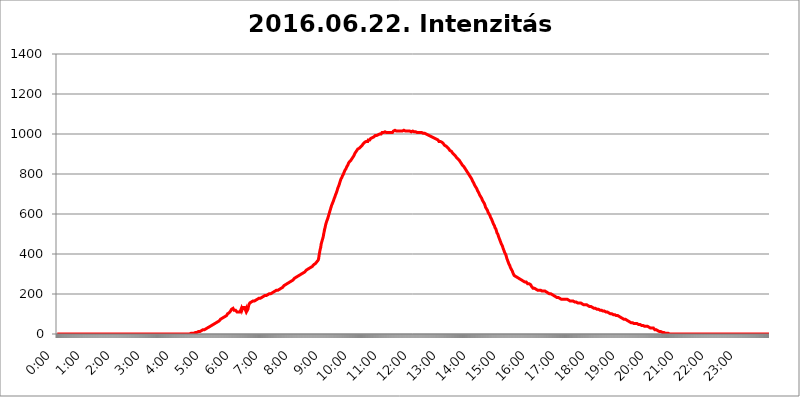
| Category | 2016.06.22. Intenzitás [W/m^2] |
|---|---|
| 0.0 | 0 |
| 0.0006944444444444445 | 0 |
| 0.001388888888888889 | 0 |
| 0.0020833333333333333 | 0 |
| 0.002777777777777778 | 0 |
| 0.003472222222222222 | 0 |
| 0.004166666666666667 | 0 |
| 0.004861111111111111 | 0 |
| 0.005555555555555556 | 0 |
| 0.0062499999999999995 | 0 |
| 0.006944444444444444 | 0 |
| 0.007638888888888889 | 0 |
| 0.008333333333333333 | 0 |
| 0.009027777777777779 | 0 |
| 0.009722222222222222 | 0 |
| 0.010416666666666666 | 0 |
| 0.011111111111111112 | 0 |
| 0.011805555555555555 | 0 |
| 0.012499999999999999 | 0 |
| 0.013194444444444444 | 0 |
| 0.013888888888888888 | 0 |
| 0.014583333333333332 | 0 |
| 0.015277777777777777 | 0 |
| 0.015972222222222224 | 0 |
| 0.016666666666666666 | 0 |
| 0.017361111111111112 | 0 |
| 0.018055555555555557 | 0 |
| 0.01875 | 0 |
| 0.019444444444444445 | 0 |
| 0.02013888888888889 | 0 |
| 0.020833333333333332 | 0 |
| 0.02152777777777778 | 0 |
| 0.022222222222222223 | 0 |
| 0.02291666666666667 | 0 |
| 0.02361111111111111 | 0 |
| 0.024305555555555556 | 0 |
| 0.024999999999999998 | 0 |
| 0.025694444444444447 | 0 |
| 0.02638888888888889 | 0 |
| 0.027083333333333334 | 0 |
| 0.027777777777777776 | 0 |
| 0.02847222222222222 | 0 |
| 0.029166666666666664 | 0 |
| 0.029861111111111113 | 0 |
| 0.030555555555555555 | 0 |
| 0.03125 | 0 |
| 0.03194444444444445 | 0 |
| 0.03263888888888889 | 0 |
| 0.03333333333333333 | 0 |
| 0.034027777777777775 | 0 |
| 0.034722222222222224 | 0 |
| 0.035416666666666666 | 0 |
| 0.036111111111111115 | 0 |
| 0.03680555555555556 | 0 |
| 0.0375 | 0 |
| 0.03819444444444444 | 0 |
| 0.03888888888888889 | 0 |
| 0.03958333333333333 | 0 |
| 0.04027777777777778 | 0 |
| 0.04097222222222222 | 0 |
| 0.041666666666666664 | 0 |
| 0.042361111111111106 | 0 |
| 0.04305555555555556 | 0 |
| 0.043750000000000004 | 0 |
| 0.044444444444444446 | 0 |
| 0.04513888888888889 | 0 |
| 0.04583333333333334 | 0 |
| 0.04652777777777778 | 0 |
| 0.04722222222222222 | 0 |
| 0.04791666666666666 | 0 |
| 0.04861111111111111 | 0 |
| 0.049305555555555554 | 0 |
| 0.049999999999999996 | 0 |
| 0.05069444444444445 | 0 |
| 0.051388888888888894 | 0 |
| 0.052083333333333336 | 0 |
| 0.05277777777777778 | 0 |
| 0.05347222222222222 | 0 |
| 0.05416666666666667 | 0 |
| 0.05486111111111111 | 0 |
| 0.05555555555555555 | 0 |
| 0.05625 | 0 |
| 0.05694444444444444 | 0 |
| 0.057638888888888885 | 0 |
| 0.05833333333333333 | 0 |
| 0.05902777777777778 | 0 |
| 0.059722222222222225 | 0 |
| 0.06041666666666667 | 0 |
| 0.061111111111111116 | 0 |
| 0.06180555555555556 | 0 |
| 0.0625 | 0 |
| 0.06319444444444444 | 0 |
| 0.06388888888888888 | 0 |
| 0.06458333333333334 | 0 |
| 0.06527777777777778 | 0 |
| 0.06597222222222222 | 0 |
| 0.06666666666666667 | 0 |
| 0.06736111111111111 | 0 |
| 0.06805555555555555 | 0 |
| 0.06874999999999999 | 0 |
| 0.06944444444444443 | 0 |
| 0.07013888888888889 | 0 |
| 0.07083333333333333 | 0 |
| 0.07152777777777779 | 0 |
| 0.07222222222222223 | 0 |
| 0.07291666666666667 | 0 |
| 0.07361111111111111 | 0 |
| 0.07430555555555556 | 0 |
| 0.075 | 0 |
| 0.07569444444444444 | 0 |
| 0.0763888888888889 | 0 |
| 0.07708333333333334 | 0 |
| 0.07777777777777778 | 0 |
| 0.07847222222222222 | 0 |
| 0.07916666666666666 | 0 |
| 0.0798611111111111 | 0 |
| 0.08055555555555556 | 0 |
| 0.08125 | 0 |
| 0.08194444444444444 | 0 |
| 0.08263888888888889 | 0 |
| 0.08333333333333333 | 0 |
| 0.08402777777777777 | 0 |
| 0.08472222222222221 | 0 |
| 0.08541666666666665 | 0 |
| 0.08611111111111112 | 0 |
| 0.08680555555555557 | 0 |
| 0.08750000000000001 | 0 |
| 0.08819444444444445 | 0 |
| 0.08888888888888889 | 0 |
| 0.08958333333333333 | 0 |
| 0.09027777777777778 | 0 |
| 0.09097222222222222 | 0 |
| 0.09166666666666667 | 0 |
| 0.09236111111111112 | 0 |
| 0.09305555555555556 | 0 |
| 0.09375 | 0 |
| 0.09444444444444444 | 0 |
| 0.09513888888888888 | 0 |
| 0.09583333333333333 | 0 |
| 0.09652777777777777 | 0 |
| 0.09722222222222222 | 0 |
| 0.09791666666666667 | 0 |
| 0.09861111111111111 | 0 |
| 0.09930555555555555 | 0 |
| 0.09999999999999999 | 0 |
| 0.10069444444444443 | 0 |
| 0.1013888888888889 | 0 |
| 0.10208333333333335 | 0 |
| 0.10277777777777779 | 0 |
| 0.10347222222222223 | 0 |
| 0.10416666666666667 | 0 |
| 0.10486111111111111 | 0 |
| 0.10555555555555556 | 0 |
| 0.10625 | 0 |
| 0.10694444444444444 | 0 |
| 0.1076388888888889 | 0 |
| 0.10833333333333334 | 0 |
| 0.10902777777777778 | 0 |
| 0.10972222222222222 | 0 |
| 0.1111111111111111 | 0 |
| 0.11180555555555556 | 0 |
| 0.11180555555555556 | 0 |
| 0.1125 | 0 |
| 0.11319444444444444 | 0 |
| 0.11388888888888889 | 0 |
| 0.11458333333333333 | 0 |
| 0.11527777777777777 | 0 |
| 0.11597222222222221 | 0 |
| 0.11666666666666665 | 0 |
| 0.1173611111111111 | 0 |
| 0.11805555555555557 | 0 |
| 0.11944444444444445 | 0 |
| 0.12013888888888889 | 0 |
| 0.12083333333333333 | 0 |
| 0.12152777777777778 | 0 |
| 0.12222222222222223 | 0 |
| 0.12291666666666667 | 0 |
| 0.12291666666666667 | 0 |
| 0.12361111111111112 | 0 |
| 0.12430555555555556 | 0 |
| 0.125 | 0 |
| 0.12569444444444444 | 0 |
| 0.12638888888888888 | 0 |
| 0.12708333333333333 | 0 |
| 0.16875 | 0 |
| 0.12847222222222224 | 0 |
| 0.12916666666666668 | 0 |
| 0.12986111111111112 | 0 |
| 0.13055555555555556 | 0 |
| 0.13125 | 0 |
| 0.13194444444444445 | 0 |
| 0.1326388888888889 | 0 |
| 0.13333333333333333 | 0 |
| 0.13402777777777777 | 0 |
| 0.13402777777777777 | 0 |
| 0.13472222222222222 | 0 |
| 0.13541666666666666 | 0 |
| 0.1361111111111111 | 0 |
| 0.13749999999999998 | 0 |
| 0.13819444444444443 | 0 |
| 0.1388888888888889 | 0 |
| 0.13958333333333334 | 0 |
| 0.14027777777777778 | 0 |
| 0.14097222222222222 | 0 |
| 0.14166666666666666 | 0 |
| 0.1423611111111111 | 0 |
| 0.14305555555555557 | 0 |
| 0.14375000000000002 | 0 |
| 0.14444444444444446 | 0 |
| 0.1451388888888889 | 0 |
| 0.1451388888888889 | 0 |
| 0.14652777777777778 | 0 |
| 0.14722222222222223 | 0 |
| 0.14791666666666667 | 0 |
| 0.1486111111111111 | 0 |
| 0.14930555555555555 | 0 |
| 0.15 | 0 |
| 0.15069444444444444 | 0 |
| 0.15138888888888888 | 0 |
| 0.15208333333333332 | 0 |
| 0.15277777777777776 | 0 |
| 0.15347222222222223 | 0 |
| 0.15416666666666667 | 0 |
| 0.15486111111111112 | 0 |
| 0.15555555555555556 | 0 |
| 0.15625 | 0 |
| 0.15694444444444444 | 0 |
| 0.15763888888888888 | 0 |
| 0.15833333333333333 | 0 |
| 0.15902777777777777 | 0 |
| 0.15972222222222224 | 0 |
| 0.16041666666666668 | 0 |
| 0.16111111111111112 | 0 |
| 0.16180555555555556 | 0 |
| 0.1625 | 0 |
| 0.16319444444444445 | 0 |
| 0.1638888888888889 | 0 |
| 0.16458333333333333 | 0 |
| 0.16527777777777777 | 0 |
| 0.16597222222222222 | 0 |
| 0.16666666666666666 | 0 |
| 0.1673611111111111 | 0 |
| 0.16805555555555554 | 0 |
| 0.16874999999999998 | 0 |
| 0.16944444444444443 | 0 |
| 0.17013888888888887 | 0 |
| 0.1708333333333333 | 0 |
| 0.17152777777777775 | 0 |
| 0.17222222222222225 | 0 |
| 0.1729166666666667 | 0 |
| 0.17361111111111113 | 0 |
| 0.17430555555555557 | 0 |
| 0.17500000000000002 | 0 |
| 0.17569444444444446 | 0 |
| 0.1763888888888889 | 0 |
| 0.17708333333333334 | 0 |
| 0.17777777777777778 | 0 |
| 0.17847222222222223 | 0 |
| 0.17916666666666667 | 0 |
| 0.1798611111111111 | 0 |
| 0.18055555555555555 | 0 |
| 0.18125 | 0 |
| 0.18194444444444444 | 0 |
| 0.1826388888888889 | 0 |
| 0.18333333333333335 | 0 |
| 0.1840277777777778 | 0 |
| 0.18472222222222223 | 0 |
| 0.18541666666666667 | 0 |
| 0.18611111111111112 | 0 |
| 0.18680555555555556 | 3.525 |
| 0.1875 | 3.525 |
| 0.18819444444444444 | 3.525 |
| 0.18888888888888888 | 3.525 |
| 0.18958333333333333 | 3.525 |
| 0.19027777777777777 | 3.525 |
| 0.1909722222222222 | 3.525 |
| 0.19166666666666665 | 3.525 |
| 0.19236111111111112 | 3.525 |
| 0.19305555555555554 | 7.887 |
| 0.19375 | 7.887 |
| 0.19444444444444445 | 7.887 |
| 0.1951388888888889 | 7.887 |
| 0.19583333333333333 | 7.887 |
| 0.19652777777777777 | 7.887 |
| 0.19722222222222222 | 12.257 |
| 0.19791666666666666 | 12.257 |
| 0.1986111111111111 | 12.257 |
| 0.19930555555555554 | 12.257 |
| 0.19999999999999998 | 12.257 |
| 0.20069444444444443 | 16.636 |
| 0.20138888888888887 | 16.636 |
| 0.2020833333333333 | 16.636 |
| 0.2027777777777778 | 16.636 |
| 0.2034722222222222 | 21.024 |
| 0.2041666666666667 | 21.024 |
| 0.20486111111111113 | 21.024 |
| 0.20555555555555557 | 21.024 |
| 0.20625000000000002 | 21.024 |
| 0.20694444444444446 | 25.419 |
| 0.2076388888888889 | 25.419 |
| 0.20833333333333334 | 25.419 |
| 0.20902777777777778 | 29.823 |
| 0.20972222222222223 | 29.823 |
| 0.21041666666666667 | 29.823 |
| 0.2111111111111111 | 34.234 |
| 0.21180555555555555 | 34.234 |
| 0.2125 | 34.234 |
| 0.21319444444444444 | 34.234 |
| 0.2138888888888889 | 38.653 |
| 0.21458333333333335 | 38.653 |
| 0.2152777777777778 | 38.653 |
| 0.21597222222222223 | 43.079 |
| 0.21666666666666667 | 43.079 |
| 0.21736111111111112 | 43.079 |
| 0.21805555555555556 | 47.511 |
| 0.21875 | 47.511 |
| 0.21944444444444444 | 47.511 |
| 0.22013888888888888 | 47.511 |
| 0.22083333333333333 | 51.951 |
| 0.22152777777777777 | 51.951 |
| 0.2222222222222222 | 56.398 |
| 0.22291666666666665 | 56.398 |
| 0.2236111111111111 | 60.85 |
| 0.22430555555555556 | 60.85 |
| 0.225 | 60.85 |
| 0.22569444444444445 | 65.31 |
| 0.2263888888888889 | 65.31 |
| 0.22708333333333333 | 65.31 |
| 0.22777777777777777 | 69.775 |
| 0.22847222222222222 | 69.775 |
| 0.22916666666666666 | 74.246 |
| 0.2298611111111111 | 74.246 |
| 0.23055555555555554 | 74.246 |
| 0.23124999999999998 | 78.722 |
| 0.23194444444444443 | 78.722 |
| 0.23263888888888887 | 78.722 |
| 0.2333333333333333 | 83.205 |
| 0.2340277777777778 | 83.205 |
| 0.2347222222222222 | 87.692 |
| 0.2354166666666667 | 87.692 |
| 0.23611111111111113 | 92.184 |
| 0.23680555555555557 | 92.184 |
| 0.23750000000000002 | 92.184 |
| 0.23819444444444446 | 96.682 |
| 0.2388888888888889 | 101.184 |
| 0.23958333333333334 | 101.184 |
| 0.24027777777777778 | 105.69 |
| 0.24097222222222223 | 105.69 |
| 0.24166666666666667 | 110.201 |
| 0.2423611111111111 | 110.201 |
| 0.24305555555555555 | 114.716 |
| 0.24375 | 119.235 |
| 0.24444444444444446 | 123.758 |
| 0.24513888888888888 | 123.758 |
| 0.24583333333333335 | 128.284 |
| 0.2465277777777778 | 128.284 |
| 0.24722222222222223 | 128.284 |
| 0.24791666666666667 | 119.235 |
| 0.24861111111111112 | 119.235 |
| 0.24930555555555556 | 123.758 |
| 0.25 | 119.235 |
| 0.25069444444444444 | 119.235 |
| 0.2513888888888889 | 114.716 |
| 0.2520833333333333 | 110.201 |
| 0.25277777777777777 | 110.201 |
| 0.2534722222222222 | 110.201 |
| 0.25416666666666665 | 110.201 |
| 0.2548611111111111 | 110.201 |
| 0.2555555555555556 | 110.201 |
| 0.25625000000000003 | 110.201 |
| 0.2569444444444445 | 110.201 |
| 0.2576388888888889 | 114.716 |
| 0.25833333333333336 | 128.284 |
| 0.2590277777777778 | 119.235 |
| 0.25972222222222224 | 119.235 |
| 0.2604166666666667 | 132.814 |
| 0.2611111111111111 | 132.814 |
| 0.26180555555555557 | 137.347 |
| 0.2625 | 132.814 |
| 0.26319444444444445 | 132.814 |
| 0.2638888888888889 | 137.347 |
| 0.26458333333333334 | 114.716 |
| 0.2652777777777778 | 123.758 |
| 0.2659722222222222 | 114.716 |
| 0.26666666666666666 | 119.235 |
| 0.2673611111111111 | 123.758 |
| 0.26805555555555555 | 123.758 |
| 0.26875 | 146.423 |
| 0.26944444444444443 | 150.964 |
| 0.2701388888888889 | 155.509 |
| 0.2708333333333333 | 155.509 |
| 0.27152777777777776 | 160.056 |
| 0.2722222222222222 | 160.056 |
| 0.27291666666666664 | 160.056 |
| 0.2736111111111111 | 164.605 |
| 0.2743055555555555 | 164.605 |
| 0.27499999999999997 | 164.605 |
| 0.27569444444444446 | 164.605 |
| 0.27638888888888885 | 164.605 |
| 0.27708333333333335 | 169.156 |
| 0.2777777777777778 | 169.156 |
| 0.27847222222222223 | 169.156 |
| 0.2791666666666667 | 169.156 |
| 0.2798611111111111 | 173.709 |
| 0.28055555555555556 | 173.709 |
| 0.28125 | 173.709 |
| 0.28194444444444444 | 173.709 |
| 0.2826388888888889 | 178.264 |
| 0.2833333333333333 | 178.264 |
| 0.28402777777777777 | 178.264 |
| 0.2847222222222222 | 178.264 |
| 0.28541666666666665 | 182.82 |
| 0.28611111111111115 | 182.82 |
| 0.28680555555555554 | 182.82 |
| 0.28750000000000003 | 182.82 |
| 0.2881944444444445 | 187.378 |
| 0.2888888888888889 | 187.378 |
| 0.28958333333333336 | 187.378 |
| 0.2902777777777778 | 187.378 |
| 0.29097222222222224 | 191.937 |
| 0.2916666666666667 | 191.937 |
| 0.2923611111111111 | 191.937 |
| 0.29305555555555557 | 191.937 |
| 0.29375 | 196.497 |
| 0.29444444444444445 | 196.497 |
| 0.2951388888888889 | 196.497 |
| 0.29583333333333334 | 201.058 |
| 0.2965277777777778 | 201.058 |
| 0.2972222222222222 | 201.058 |
| 0.29791666666666666 | 201.058 |
| 0.2986111111111111 | 201.058 |
| 0.29930555555555555 | 201.058 |
| 0.3 | 205.62 |
| 0.30069444444444443 | 205.62 |
| 0.3013888888888889 | 205.62 |
| 0.3020833333333333 | 210.182 |
| 0.30277777777777776 | 210.182 |
| 0.3034722222222222 | 210.182 |
| 0.30416666666666664 | 210.182 |
| 0.3048611111111111 | 214.746 |
| 0.3055555555555555 | 214.746 |
| 0.30624999999999997 | 214.746 |
| 0.3069444444444444 | 214.746 |
| 0.3076388888888889 | 219.309 |
| 0.30833333333333335 | 219.309 |
| 0.3090277777777778 | 219.309 |
| 0.30972222222222223 | 219.309 |
| 0.3104166666666667 | 223.873 |
| 0.3111111111111111 | 223.873 |
| 0.31180555555555556 | 223.873 |
| 0.3125 | 228.436 |
| 0.31319444444444444 | 228.436 |
| 0.3138888888888889 | 228.436 |
| 0.3145833333333333 | 233 |
| 0.31527777777777777 | 233 |
| 0.3159722222222222 | 233 |
| 0.31666666666666665 | 237.564 |
| 0.31736111111111115 | 237.564 |
| 0.31805555555555554 | 242.127 |
| 0.31875000000000003 | 242.127 |
| 0.3194444444444445 | 242.127 |
| 0.3201388888888889 | 246.689 |
| 0.32083333333333336 | 246.689 |
| 0.3215277777777778 | 251.251 |
| 0.32222222222222224 | 251.251 |
| 0.3229166666666667 | 251.251 |
| 0.3236111111111111 | 255.813 |
| 0.32430555555555557 | 255.813 |
| 0.325 | 255.813 |
| 0.32569444444444445 | 260.373 |
| 0.3263888888888889 | 260.373 |
| 0.32708333333333334 | 260.373 |
| 0.3277777777777778 | 264.932 |
| 0.3284722222222222 | 264.932 |
| 0.32916666666666666 | 269.49 |
| 0.3298611111111111 | 269.49 |
| 0.33055555555555555 | 269.49 |
| 0.33125 | 274.047 |
| 0.33194444444444443 | 274.047 |
| 0.3326388888888889 | 278.603 |
| 0.3333333333333333 | 278.603 |
| 0.3340277777777778 | 278.603 |
| 0.3347222222222222 | 283.156 |
| 0.3354166666666667 | 283.156 |
| 0.3361111111111111 | 283.156 |
| 0.3368055555555556 | 287.709 |
| 0.33749999999999997 | 287.709 |
| 0.33819444444444446 | 287.709 |
| 0.33888888888888885 | 292.259 |
| 0.33958333333333335 | 292.259 |
| 0.34027777777777773 | 296.808 |
| 0.34097222222222223 | 296.808 |
| 0.3416666666666666 | 296.808 |
| 0.3423611111111111 | 301.354 |
| 0.3430555555555555 | 301.354 |
| 0.34375 | 305.898 |
| 0.3444444444444445 | 305.898 |
| 0.3451388888888889 | 305.898 |
| 0.3458333333333334 | 310.44 |
| 0.34652777777777777 | 310.44 |
| 0.34722222222222227 | 310.44 |
| 0.34791666666666665 | 314.98 |
| 0.34861111111111115 | 314.98 |
| 0.34930555555555554 | 319.517 |
| 0.35000000000000003 | 319.517 |
| 0.3506944444444444 | 324.052 |
| 0.3513888888888889 | 324.052 |
| 0.3520833333333333 | 324.052 |
| 0.3527777777777778 | 328.584 |
| 0.3534722222222222 | 328.584 |
| 0.3541666666666667 | 328.584 |
| 0.3548611111111111 | 333.113 |
| 0.35555555555555557 | 333.113 |
| 0.35625 | 337.639 |
| 0.35694444444444445 | 337.639 |
| 0.3576388888888889 | 337.639 |
| 0.35833333333333334 | 342.162 |
| 0.3590277777777778 | 342.162 |
| 0.3597222222222222 | 346.682 |
| 0.36041666666666666 | 351.198 |
| 0.3611111111111111 | 351.198 |
| 0.36180555555555555 | 351.198 |
| 0.3625 | 355.712 |
| 0.36319444444444443 | 355.712 |
| 0.3638888888888889 | 360.221 |
| 0.3645833333333333 | 360.221 |
| 0.3652777777777778 | 364.728 |
| 0.3659722222222222 | 369.23 |
| 0.3666666666666667 | 378.224 |
| 0.3673611111111111 | 396.164 |
| 0.3680555555555556 | 409.574 |
| 0.36874999999999997 | 422.943 |
| 0.36944444444444446 | 431.833 |
| 0.37013888888888885 | 449.551 |
| 0.37083333333333335 | 458.38 |
| 0.37152777777777773 | 467.187 |
| 0.37222222222222223 | 475.972 |
| 0.3729166666666666 | 484.735 |
| 0.3736111111111111 | 497.836 |
| 0.3743055555555555 | 510.885 |
| 0.375 | 523.88 |
| 0.3756944444444445 | 532.513 |
| 0.3763888888888889 | 545.416 |
| 0.3770833333333334 | 553.986 |
| 0.37777777777777777 | 562.53 |
| 0.37847222222222227 | 566.793 |
| 0.37916666666666665 | 575.299 |
| 0.37986111111111115 | 583.779 |
| 0.38055555555555554 | 592.233 |
| 0.38125000000000003 | 600.661 |
| 0.3819444444444444 | 609.062 |
| 0.3826388888888889 | 617.436 |
| 0.3833333333333333 | 625.784 |
| 0.3840277777777778 | 634.105 |
| 0.3847222222222222 | 642.4 |
| 0.3854166666666667 | 646.537 |
| 0.3861111111111111 | 654.791 |
| 0.38680555555555557 | 658.909 |
| 0.3875 | 667.123 |
| 0.38819444444444445 | 675.311 |
| 0.3888888888888889 | 679.395 |
| 0.38958333333333334 | 687.544 |
| 0.3902777777777778 | 695.666 |
| 0.3909722222222222 | 699.717 |
| 0.39166666666666666 | 707.8 |
| 0.3923611111111111 | 715.858 |
| 0.39305555555555555 | 723.889 |
| 0.39375 | 731.896 |
| 0.39444444444444443 | 735.89 |
| 0.3951388888888889 | 743.859 |
| 0.3958333333333333 | 751.803 |
| 0.3965277777777778 | 759.723 |
| 0.3972222222222222 | 767.62 |
| 0.3979166666666667 | 775.492 |
| 0.3986111111111111 | 779.42 |
| 0.3993055555555556 | 783.342 |
| 0.39999999999999997 | 791.169 |
| 0.40069444444444446 | 795.074 |
| 0.40138888888888885 | 798.974 |
| 0.40208333333333335 | 806.757 |
| 0.40277777777777773 | 810.641 |
| 0.40347222222222223 | 818.392 |
| 0.4041666666666666 | 822.26 |
| 0.4048611111111111 | 826.123 |
| 0.4055555555555555 | 829.981 |
| 0.40625 | 837.682 |
| 0.4069444444444445 | 841.526 |
| 0.4076388888888889 | 845.365 |
| 0.4083333333333334 | 853.029 |
| 0.40902777777777777 | 856.855 |
| 0.40972222222222227 | 860.676 |
| 0.41041666666666665 | 860.676 |
| 0.41111111111111115 | 864.493 |
| 0.41180555555555554 | 868.305 |
| 0.41250000000000003 | 872.114 |
| 0.4131944444444444 | 875.918 |
| 0.4138888888888889 | 879.719 |
| 0.4145833333333333 | 883.516 |
| 0.4152777777777778 | 887.309 |
| 0.4159722222222222 | 891.099 |
| 0.4166666666666667 | 894.885 |
| 0.4173611111111111 | 902.447 |
| 0.41805555555555557 | 906.223 |
| 0.41875 | 909.996 |
| 0.41944444444444445 | 909.996 |
| 0.4201388888888889 | 917.534 |
| 0.42083333333333334 | 921.298 |
| 0.4215277777777778 | 925.06 |
| 0.4222222222222222 | 925.06 |
| 0.42291666666666666 | 928.819 |
| 0.4236111111111111 | 928.819 |
| 0.42430555555555555 | 932.576 |
| 0.425 | 932.576 |
| 0.42569444444444443 | 936.33 |
| 0.4263888888888889 | 940.082 |
| 0.4270833333333333 | 940.082 |
| 0.4277777777777778 | 943.832 |
| 0.4284722222222222 | 947.58 |
| 0.4291666666666667 | 951.327 |
| 0.4298611111111111 | 951.327 |
| 0.4305555555555556 | 955.071 |
| 0.43124999999999997 | 958.814 |
| 0.43194444444444446 | 962.555 |
| 0.43263888888888885 | 962.555 |
| 0.43333333333333335 | 962.555 |
| 0.43402777777777773 | 962.555 |
| 0.43472222222222223 | 962.555 |
| 0.4354166666666666 | 962.555 |
| 0.4361111111111111 | 970.034 |
| 0.4368055555555555 | 970.034 |
| 0.4375 | 970.034 |
| 0.4381944444444445 | 970.034 |
| 0.4388888888888889 | 973.772 |
| 0.4395833333333334 | 977.508 |
| 0.44027777777777777 | 977.508 |
| 0.44097222222222227 | 981.244 |
| 0.44166666666666665 | 981.244 |
| 0.44236111111111115 | 984.98 |
| 0.44305555555555554 | 984.98 |
| 0.44375000000000003 | 984.98 |
| 0.4444444444444444 | 988.714 |
| 0.4451388888888889 | 988.714 |
| 0.4458333333333333 | 992.448 |
| 0.4465277777777778 | 992.448 |
| 0.4472222222222222 | 992.448 |
| 0.4479166666666667 | 992.448 |
| 0.4486111111111111 | 996.182 |
| 0.44930555555555557 | 996.182 |
| 0.45 | 996.182 |
| 0.45069444444444445 | 996.182 |
| 0.4513888888888889 | 999.916 |
| 0.45208333333333334 | 999.916 |
| 0.4527777777777778 | 999.916 |
| 0.4534722222222222 | 999.916 |
| 0.45416666666666666 | 999.916 |
| 0.4548611111111111 | 999.916 |
| 0.45555555555555555 | 1007.383 |
| 0.45625 | 1007.383 |
| 0.45694444444444443 | 1007.383 |
| 0.4576388888888889 | 1007.383 |
| 0.4583333333333333 | 1007.383 |
| 0.4590277777777778 | 1007.383 |
| 0.4597222222222222 | 1011.118 |
| 0.4604166666666667 | 1007.383 |
| 0.4611111111111111 | 1007.383 |
| 0.4618055555555556 | 1007.383 |
| 0.46249999999999997 | 1007.383 |
| 0.46319444444444446 | 1003.65 |
| 0.46388888888888885 | 1007.383 |
| 0.46458333333333335 | 1007.383 |
| 0.46527777777777773 | 1007.383 |
| 0.46597222222222223 | 1007.383 |
| 0.4666666666666666 | 1007.383 |
| 0.4673611111111111 | 1007.383 |
| 0.4680555555555555 | 1007.383 |
| 0.46875 | 1007.383 |
| 0.4694444444444445 | 1007.383 |
| 0.4701388888888889 | 1007.383 |
| 0.4708333333333334 | 1007.383 |
| 0.47152777777777777 | 1014.852 |
| 0.47222222222222227 | 1014.852 |
| 0.47291666666666665 | 1018.587 |
| 0.47361111111111115 | 1018.587 |
| 0.47430555555555554 | 1014.852 |
| 0.47500000000000003 | 1014.852 |
| 0.4756944444444444 | 1014.852 |
| 0.4763888888888889 | 1014.852 |
| 0.4770833333333333 | 1014.852 |
| 0.4777777777777778 | 1014.852 |
| 0.4784722222222222 | 1014.852 |
| 0.4791666666666667 | 1014.852 |
| 0.4798611111111111 | 1014.852 |
| 0.48055555555555557 | 1014.852 |
| 0.48125 | 1014.852 |
| 0.48194444444444445 | 1014.852 |
| 0.4826388888888889 | 1014.852 |
| 0.48333333333333334 | 1014.852 |
| 0.4840277777777778 | 1014.852 |
| 0.4847222222222222 | 1018.587 |
| 0.48541666666666666 | 1018.587 |
| 0.4861111111111111 | 1018.587 |
| 0.48680555555555555 | 1018.587 |
| 0.4875 | 1014.852 |
| 0.48819444444444443 | 1014.852 |
| 0.4888888888888889 | 1014.852 |
| 0.4895833333333333 | 1014.852 |
| 0.4902777777777778 | 1014.852 |
| 0.4909722222222222 | 1014.852 |
| 0.4916666666666667 | 1014.852 |
| 0.4923611111111111 | 1014.852 |
| 0.4930555555555556 | 1014.852 |
| 0.49374999999999997 | 1011.118 |
| 0.49444444444444446 | 1014.852 |
| 0.49513888888888885 | 1014.852 |
| 0.49583333333333335 | 1014.852 |
| 0.49652777777777773 | 1011.118 |
| 0.49722222222222223 | 1014.852 |
| 0.4979166666666666 | 1014.852 |
| 0.4986111111111111 | 1014.852 |
| 0.4993055555555555 | 1014.852 |
| 0.5 | 1011.118 |
| 0.5006944444444444 | 1011.118 |
| 0.5013888888888889 | 1011.118 |
| 0.5020833333333333 | 1011.118 |
| 0.5027777777777778 | 1011.118 |
| 0.5034722222222222 | 1007.383 |
| 0.5041666666666667 | 1007.383 |
| 0.5048611111111111 | 1007.383 |
| 0.5055555555555555 | 1007.383 |
| 0.50625 | 1007.383 |
| 0.5069444444444444 | 1007.383 |
| 0.5076388888888889 | 1007.383 |
| 0.5083333333333333 | 1007.383 |
| 0.5090277777777777 | 1007.383 |
| 0.5097222222222222 | 1003.65 |
| 0.5104166666666666 | 1007.383 |
| 0.5111111111111112 | 1007.383 |
| 0.5118055555555555 | 1003.65 |
| 0.5125000000000001 | 1003.65 |
| 0.5131944444444444 | 1003.65 |
| 0.513888888888889 | 999.916 |
| 0.5145833333333333 | 999.916 |
| 0.5152777777777778 | 1003.65 |
| 0.5159722222222222 | 999.916 |
| 0.5166666666666667 | 999.916 |
| 0.517361111111111 | 999.916 |
| 0.5180555555555556 | 999.916 |
| 0.5187499999999999 | 996.182 |
| 0.5194444444444445 | 996.182 |
| 0.5201388888888888 | 996.182 |
| 0.5208333333333334 | 992.448 |
| 0.5215277777777778 | 992.448 |
| 0.5222222222222223 | 992.448 |
| 0.5229166666666667 | 992.448 |
| 0.5236111111111111 | 988.714 |
| 0.5243055555555556 | 988.714 |
| 0.525 | 984.98 |
| 0.5256944444444445 | 984.98 |
| 0.5263888888888889 | 984.98 |
| 0.5270833333333333 | 984.98 |
| 0.5277777777777778 | 981.244 |
| 0.5284722222222222 | 977.508 |
| 0.5291666666666667 | 977.508 |
| 0.5298611111111111 | 977.508 |
| 0.5305555555555556 | 977.508 |
| 0.53125 | 973.772 |
| 0.5319444444444444 | 973.772 |
| 0.5326388888888889 | 970.034 |
| 0.5333333333333333 | 970.034 |
| 0.5340277777777778 | 970.034 |
| 0.5347222222222222 | 966.295 |
| 0.5354166666666667 | 962.555 |
| 0.5361111111111111 | 962.555 |
| 0.5368055555555555 | 962.555 |
| 0.5375 | 962.555 |
| 0.5381944444444444 | 958.814 |
| 0.5388888888888889 | 958.814 |
| 0.5395833333333333 | 958.814 |
| 0.5402777777777777 | 955.071 |
| 0.5409722222222222 | 955.071 |
| 0.5416666666666666 | 951.327 |
| 0.5423611111111112 | 947.58 |
| 0.5430555555555555 | 943.832 |
| 0.5437500000000001 | 943.832 |
| 0.5444444444444444 | 943.832 |
| 0.545138888888889 | 940.082 |
| 0.5458333333333333 | 936.33 |
| 0.5465277777777778 | 936.33 |
| 0.5472222222222222 | 932.576 |
| 0.5479166666666667 | 928.819 |
| 0.548611111111111 | 928.819 |
| 0.5493055555555556 | 925.06 |
| 0.5499999999999999 | 925.06 |
| 0.5506944444444445 | 917.534 |
| 0.5513888888888888 | 917.534 |
| 0.5520833333333334 | 913.766 |
| 0.5527777777777778 | 913.766 |
| 0.5534722222222223 | 909.996 |
| 0.5541666666666667 | 906.223 |
| 0.5548611111111111 | 902.447 |
| 0.5555555555555556 | 902.447 |
| 0.55625 | 898.668 |
| 0.5569444444444445 | 894.885 |
| 0.5576388888888889 | 894.885 |
| 0.5583333333333333 | 891.099 |
| 0.5590277777777778 | 887.309 |
| 0.5597222222222222 | 883.516 |
| 0.5604166666666667 | 879.719 |
| 0.5611111111111111 | 879.719 |
| 0.5618055555555556 | 875.918 |
| 0.5625 | 875.918 |
| 0.5631944444444444 | 872.114 |
| 0.5638888888888889 | 868.305 |
| 0.5645833333333333 | 864.493 |
| 0.5652777777777778 | 860.676 |
| 0.5659722222222222 | 856.855 |
| 0.5666666666666667 | 853.029 |
| 0.5673611111111111 | 849.199 |
| 0.5680555555555555 | 845.365 |
| 0.56875 | 845.365 |
| 0.5694444444444444 | 841.526 |
| 0.5701388888888889 | 837.682 |
| 0.5708333333333333 | 837.682 |
| 0.5715277777777777 | 829.981 |
| 0.5722222222222222 | 826.123 |
| 0.5729166666666666 | 822.26 |
| 0.5736111111111112 | 818.392 |
| 0.5743055555555555 | 814.519 |
| 0.5750000000000001 | 810.641 |
| 0.5756944444444444 | 806.757 |
| 0.576388888888889 | 802.868 |
| 0.5770833333333333 | 798.974 |
| 0.5777777777777778 | 795.074 |
| 0.5784722222222222 | 791.169 |
| 0.5791666666666667 | 787.258 |
| 0.579861111111111 | 783.342 |
| 0.5805555555555556 | 779.42 |
| 0.5812499999999999 | 775.492 |
| 0.5819444444444445 | 771.559 |
| 0.5826388888888888 | 763.674 |
| 0.5833333333333334 | 759.723 |
| 0.5840277777777778 | 755.766 |
| 0.5847222222222223 | 751.803 |
| 0.5854166666666667 | 743.859 |
| 0.5861111111111111 | 743.859 |
| 0.5868055555555556 | 735.89 |
| 0.5875 | 731.896 |
| 0.5881944444444445 | 727.896 |
| 0.5888888888888889 | 723.889 |
| 0.5895833333333333 | 715.858 |
| 0.5902777777777778 | 711.832 |
| 0.5909722222222222 | 707.8 |
| 0.5916666666666667 | 703.762 |
| 0.5923611111111111 | 695.666 |
| 0.5930555555555556 | 691.608 |
| 0.59375 | 687.544 |
| 0.5944444444444444 | 683.473 |
| 0.5951388888888889 | 679.395 |
| 0.5958333333333333 | 675.311 |
| 0.5965277777777778 | 667.123 |
| 0.5972222222222222 | 667.123 |
| 0.5979166666666667 | 658.909 |
| 0.5986111111111111 | 654.791 |
| 0.5993055555555555 | 650.667 |
| 0.6 | 642.4 |
| 0.6006944444444444 | 634.105 |
| 0.6013888888888889 | 629.948 |
| 0.6020833333333333 | 625.784 |
| 0.6027777777777777 | 621.613 |
| 0.6034722222222222 | 617.436 |
| 0.6041666666666666 | 609.062 |
| 0.6048611111111112 | 604.864 |
| 0.6055555555555555 | 600.661 |
| 0.6062500000000001 | 596.45 |
| 0.6069444444444444 | 592.233 |
| 0.607638888888889 | 583.779 |
| 0.6083333333333333 | 579.542 |
| 0.6090277777777778 | 575.299 |
| 0.6097222222222222 | 571.049 |
| 0.6104166666666667 | 562.53 |
| 0.611111111111111 | 558.261 |
| 0.6118055555555556 | 549.704 |
| 0.6124999999999999 | 545.416 |
| 0.6131944444444445 | 541.121 |
| 0.6138888888888888 | 532.513 |
| 0.6145833333333334 | 532.513 |
| 0.6152777777777778 | 523.88 |
| 0.6159722222222223 | 515.223 |
| 0.6166666666666667 | 506.542 |
| 0.6173611111111111 | 502.192 |
| 0.6180555555555556 | 497.836 |
| 0.61875 | 489.108 |
| 0.6194444444444445 | 484.735 |
| 0.6201388888888889 | 475.972 |
| 0.6208333333333333 | 471.582 |
| 0.6215277777777778 | 462.786 |
| 0.6222222222222222 | 458.38 |
| 0.6229166666666667 | 449.551 |
| 0.6236111111111111 | 449.551 |
| 0.6243055555555556 | 440.702 |
| 0.625 | 431.833 |
| 0.6256944444444444 | 427.39 |
| 0.6263888888888889 | 418.492 |
| 0.6270833333333333 | 414.035 |
| 0.6277777777777778 | 405.108 |
| 0.6284722222222222 | 400.638 |
| 0.6291666666666667 | 396.164 |
| 0.6298611111111111 | 387.202 |
| 0.6305555555555555 | 378.224 |
| 0.63125 | 373.729 |
| 0.6319444444444444 | 364.728 |
| 0.6326388888888889 | 360.221 |
| 0.6333333333333333 | 351.198 |
| 0.6340277777777777 | 346.682 |
| 0.6347222222222222 | 342.162 |
| 0.6354166666666666 | 333.113 |
| 0.6361111111111112 | 333.113 |
| 0.6368055555555555 | 324.052 |
| 0.6375000000000001 | 319.517 |
| 0.6381944444444444 | 314.98 |
| 0.638888888888889 | 310.44 |
| 0.6395833333333333 | 301.354 |
| 0.6402777777777778 | 296.808 |
| 0.6409722222222222 | 292.259 |
| 0.6416666666666667 | 287.709 |
| 0.642361111111111 | 287.709 |
| 0.6430555555555556 | 287.709 |
| 0.6437499999999999 | 283.156 |
| 0.6444444444444445 | 283.156 |
| 0.6451388888888888 | 283.156 |
| 0.6458333333333334 | 278.603 |
| 0.6465277777777778 | 278.603 |
| 0.6472222222222223 | 278.603 |
| 0.6479166666666667 | 278.603 |
| 0.6486111111111111 | 274.047 |
| 0.6493055555555556 | 274.047 |
| 0.65 | 274.047 |
| 0.6506944444444445 | 274.047 |
| 0.6513888888888889 | 269.49 |
| 0.6520833333333333 | 269.49 |
| 0.6527777777777778 | 269.49 |
| 0.6534722222222222 | 264.932 |
| 0.6541666666666667 | 264.932 |
| 0.6548611111111111 | 260.373 |
| 0.6555555555555556 | 260.373 |
| 0.65625 | 260.373 |
| 0.6569444444444444 | 260.373 |
| 0.6576388888888889 | 260.373 |
| 0.6583333333333333 | 255.813 |
| 0.6590277777777778 | 255.813 |
| 0.6597222222222222 | 251.251 |
| 0.6604166666666667 | 251.251 |
| 0.6611111111111111 | 251.251 |
| 0.6618055555555555 | 251.251 |
| 0.6625 | 251.251 |
| 0.6631944444444444 | 251.251 |
| 0.6638888888888889 | 246.689 |
| 0.6645833333333333 | 246.689 |
| 0.6652777777777777 | 237.564 |
| 0.6659722222222222 | 233 |
| 0.6666666666666666 | 233 |
| 0.6673611111111111 | 228.436 |
| 0.6680555555555556 | 228.436 |
| 0.6687500000000001 | 228.436 |
| 0.6694444444444444 | 228.436 |
| 0.6701388888888888 | 228.436 |
| 0.6708333333333334 | 223.873 |
| 0.6715277777777778 | 223.873 |
| 0.6722222222222222 | 223.873 |
| 0.6729166666666666 | 223.873 |
| 0.6736111111111112 | 219.309 |
| 0.6743055555555556 | 219.309 |
| 0.6749999999999999 | 219.309 |
| 0.6756944444444444 | 219.309 |
| 0.6763888888888889 | 219.309 |
| 0.6770833333333334 | 219.309 |
| 0.6777777777777777 | 219.309 |
| 0.6784722222222223 | 219.309 |
| 0.6791666666666667 | 219.309 |
| 0.6798611111111111 | 214.746 |
| 0.6805555555555555 | 214.746 |
| 0.68125 | 214.746 |
| 0.6819444444444445 | 214.746 |
| 0.6826388888888889 | 214.746 |
| 0.6833333333333332 | 214.746 |
| 0.6840277777777778 | 214.746 |
| 0.6847222222222222 | 214.746 |
| 0.6854166666666667 | 210.182 |
| 0.686111111111111 | 210.182 |
| 0.6868055555555556 | 210.182 |
| 0.6875 | 205.62 |
| 0.6881944444444444 | 205.62 |
| 0.688888888888889 | 205.62 |
| 0.6895833333333333 | 205.62 |
| 0.6902777777777778 | 201.058 |
| 0.6909722222222222 | 201.058 |
| 0.6916666666666668 | 201.058 |
| 0.6923611111111111 | 201.058 |
| 0.6930555555555555 | 196.497 |
| 0.69375 | 196.497 |
| 0.6944444444444445 | 196.497 |
| 0.6951388888888889 | 196.497 |
| 0.6958333333333333 | 191.937 |
| 0.6965277777777777 | 191.937 |
| 0.6972222222222223 | 191.937 |
| 0.6979166666666666 | 191.937 |
| 0.6986111111111111 | 187.378 |
| 0.6993055555555556 | 187.378 |
| 0.7000000000000001 | 182.82 |
| 0.7006944444444444 | 182.82 |
| 0.7013888888888888 | 182.82 |
| 0.7020833333333334 | 182.82 |
| 0.7027777777777778 | 182.82 |
| 0.7034722222222222 | 178.264 |
| 0.7041666666666666 | 178.264 |
| 0.7048611111111112 | 178.264 |
| 0.7055555555555556 | 173.709 |
| 0.7062499999999999 | 178.264 |
| 0.7069444444444444 | 173.709 |
| 0.7076388888888889 | 178.264 |
| 0.7083333333333334 | 173.709 |
| 0.7090277777777777 | 173.709 |
| 0.7097222222222223 | 173.709 |
| 0.7104166666666667 | 173.709 |
| 0.7111111111111111 | 173.709 |
| 0.7118055555555555 | 173.709 |
| 0.7125 | 173.709 |
| 0.7131944444444445 | 173.709 |
| 0.7138888888888889 | 173.709 |
| 0.7145833333333332 | 169.156 |
| 0.7152777777777778 | 173.709 |
| 0.7159722222222222 | 173.709 |
| 0.7166666666666667 | 169.156 |
| 0.717361111111111 | 169.156 |
| 0.7180555555555556 | 169.156 |
| 0.71875 | 164.605 |
| 0.7194444444444444 | 164.605 |
| 0.720138888888889 | 164.605 |
| 0.7208333333333333 | 164.605 |
| 0.7215277777777778 | 164.605 |
| 0.7222222222222222 | 164.605 |
| 0.7229166666666668 | 164.605 |
| 0.7236111111111111 | 164.605 |
| 0.7243055555555555 | 164.605 |
| 0.725 | 160.056 |
| 0.7256944444444445 | 160.056 |
| 0.7263888888888889 | 160.056 |
| 0.7270833333333333 | 160.056 |
| 0.7277777777777777 | 160.056 |
| 0.7284722222222223 | 160.056 |
| 0.7291666666666666 | 155.509 |
| 0.7298611111111111 | 155.509 |
| 0.7305555555555556 | 155.509 |
| 0.7312500000000001 | 155.509 |
| 0.7319444444444444 | 155.509 |
| 0.7326388888888888 | 155.509 |
| 0.7333333333333334 | 155.509 |
| 0.7340277777777778 | 155.509 |
| 0.7347222222222222 | 155.509 |
| 0.7354166666666666 | 150.964 |
| 0.7361111111111112 | 150.964 |
| 0.7368055555555556 | 150.964 |
| 0.7374999999999999 | 146.423 |
| 0.7381944444444444 | 146.423 |
| 0.7388888888888889 | 146.423 |
| 0.7395833333333334 | 146.423 |
| 0.7402777777777777 | 146.423 |
| 0.7409722222222223 | 146.423 |
| 0.7416666666666667 | 146.423 |
| 0.7423611111111111 | 146.423 |
| 0.7430555555555555 | 141.884 |
| 0.74375 | 141.884 |
| 0.7444444444444445 | 141.884 |
| 0.7451388888888889 | 137.347 |
| 0.7458333333333332 | 137.347 |
| 0.7465277777777778 | 137.347 |
| 0.7472222222222222 | 137.347 |
| 0.7479166666666667 | 137.347 |
| 0.748611111111111 | 137.347 |
| 0.7493055555555556 | 132.814 |
| 0.75 | 132.814 |
| 0.7506944444444444 | 132.814 |
| 0.751388888888889 | 132.814 |
| 0.7520833333333333 | 132.814 |
| 0.7527777777777778 | 128.284 |
| 0.7534722222222222 | 128.284 |
| 0.7541666666666668 | 128.284 |
| 0.7548611111111111 | 128.284 |
| 0.7555555555555555 | 128.284 |
| 0.75625 | 128.284 |
| 0.7569444444444445 | 123.758 |
| 0.7576388888888889 | 123.758 |
| 0.7583333333333333 | 123.758 |
| 0.7590277777777777 | 123.758 |
| 0.7597222222222223 | 119.235 |
| 0.7604166666666666 | 119.235 |
| 0.7611111111111111 | 119.235 |
| 0.7618055555555556 | 119.235 |
| 0.7625000000000001 | 119.235 |
| 0.7631944444444444 | 119.235 |
| 0.7638888888888888 | 119.235 |
| 0.7645833333333334 | 119.235 |
| 0.7652777777777778 | 114.716 |
| 0.7659722222222222 | 114.716 |
| 0.7666666666666666 | 114.716 |
| 0.7673611111111112 | 114.716 |
| 0.7680555555555556 | 110.201 |
| 0.7687499999999999 | 110.201 |
| 0.7694444444444444 | 110.201 |
| 0.7701388888888889 | 110.201 |
| 0.7708333333333334 | 110.201 |
| 0.7715277777777777 | 110.201 |
| 0.7722222222222223 | 105.69 |
| 0.7729166666666667 | 105.69 |
| 0.7736111111111111 | 105.69 |
| 0.7743055555555555 | 105.69 |
| 0.775 | 101.184 |
| 0.7756944444444445 | 101.184 |
| 0.7763888888888889 | 101.184 |
| 0.7770833333333332 | 101.184 |
| 0.7777777777777778 | 101.184 |
| 0.7784722222222222 | 101.184 |
| 0.7791666666666667 | 101.184 |
| 0.779861111111111 | 96.682 |
| 0.7805555555555556 | 96.682 |
| 0.78125 | 96.682 |
| 0.7819444444444444 | 96.682 |
| 0.782638888888889 | 92.184 |
| 0.7833333333333333 | 92.184 |
| 0.7840277777777778 | 92.184 |
| 0.7847222222222222 | 92.184 |
| 0.7854166666666668 | 92.184 |
| 0.7861111111111111 | 92.184 |
| 0.7868055555555555 | 87.692 |
| 0.7875 | 87.692 |
| 0.7881944444444445 | 87.692 |
| 0.7888888888888889 | 83.205 |
| 0.7895833333333333 | 83.205 |
| 0.7902777777777777 | 83.205 |
| 0.7909722222222223 | 83.205 |
| 0.7916666666666666 | 83.205 |
| 0.7923611111111111 | 78.722 |
| 0.7930555555555556 | 74.246 |
| 0.7937500000000001 | 74.246 |
| 0.7944444444444444 | 74.246 |
| 0.7951388888888888 | 74.246 |
| 0.7958333333333334 | 74.246 |
| 0.7965277777777778 | 74.246 |
| 0.7972222222222222 | 74.246 |
| 0.7979166666666666 | 69.775 |
| 0.7986111111111112 | 69.775 |
| 0.7993055555555556 | 69.775 |
| 0.7999999999999999 | 69.775 |
| 0.8006944444444444 | 65.31 |
| 0.8013888888888889 | 65.31 |
| 0.8020833333333334 | 65.31 |
| 0.8027777777777777 | 60.85 |
| 0.8034722222222223 | 60.85 |
| 0.8041666666666667 | 60.85 |
| 0.8048611111111111 | 56.398 |
| 0.8055555555555555 | 56.398 |
| 0.80625 | 56.398 |
| 0.8069444444444445 | 56.398 |
| 0.8076388888888889 | 56.398 |
| 0.8083333333333332 | 51.951 |
| 0.8090277777777778 | 51.951 |
| 0.8097222222222222 | 51.951 |
| 0.8104166666666667 | 51.951 |
| 0.811111111111111 | 51.951 |
| 0.8118055555555556 | 51.951 |
| 0.8125 | 47.511 |
| 0.8131944444444444 | 51.951 |
| 0.813888888888889 | 47.511 |
| 0.8145833333333333 | 47.511 |
| 0.8152777777777778 | 47.511 |
| 0.8159722222222222 | 47.511 |
| 0.8166666666666668 | 47.511 |
| 0.8173611111111111 | 47.511 |
| 0.8180555555555555 | 47.511 |
| 0.81875 | 43.079 |
| 0.8194444444444445 | 43.079 |
| 0.8201388888888889 | 43.079 |
| 0.8208333333333333 | 43.079 |
| 0.8215277777777777 | 43.079 |
| 0.8222222222222223 | 43.079 |
| 0.8229166666666666 | 43.079 |
| 0.8236111111111111 | 38.653 |
| 0.8243055555555556 | 38.653 |
| 0.8250000000000001 | 38.653 |
| 0.8256944444444444 | 38.653 |
| 0.8263888888888888 | 38.653 |
| 0.8270833333333334 | 38.653 |
| 0.8277777777777778 | 38.653 |
| 0.8284722222222222 | 34.234 |
| 0.8291666666666666 | 34.234 |
| 0.8298611111111112 | 34.234 |
| 0.8305555555555556 | 34.234 |
| 0.8312499999999999 | 29.823 |
| 0.8319444444444444 | 29.823 |
| 0.8326388888888889 | 29.823 |
| 0.8333333333333334 | 29.823 |
| 0.8340277777777777 | 29.823 |
| 0.8347222222222223 | 29.823 |
| 0.8354166666666667 | 29.823 |
| 0.8361111111111111 | 29.823 |
| 0.8368055555555555 | 25.419 |
| 0.8375 | 25.419 |
| 0.8381944444444445 | 21.024 |
| 0.8388888888888889 | 21.024 |
| 0.8395833333333332 | 21.024 |
| 0.8402777777777778 | 21.024 |
| 0.8409722222222222 | 16.636 |
| 0.8416666666666667 | 16.636 |
| 0.842361111111111 | 16.636 |
| 0.8430555555555556 | 16.636 |
| 0.84375 | 16.636 |
| 0.8444444444444444 | 12.257 |
| 0.845138888888889 | 12.257 |
| 0.8458333333333333 | 12.257 |
| 0.8465277777777778 | 12.257 |
| 0.8472222222222222 | 12.257 |
| 0.8479166666666668 | 12.257 |
| 0.8486111111111111 | 7.887 |
| 0.8493055555555555 | 7.887 |
| 0.85 | 7.887 |
| 0.8506944444444445 | 7.887 |
| 0.8513888888888889 | 7.887 |
| 0.8520833333333333 | 3.525 |
| 0.8527777777777777 | 3.525 |
| 0.8534722222222223 | 3.525 |
| 0.8541666666666666 | 3.525 |
| 0.8548611111111111 | 3.525 |
| 0.8555555555555556 | 3.525 |
| 0.8562500000000001 | 3.525 |
| 0.8569444444444444 | 3.525 |
| 0.8576388888888888 | 0 |
| 0.8583333333333334 | 0 |
| 0.8590277777777778 | 0 |
| 0.8597222222222222 | 0 |
| 0.8604166666666666 | 0 |
| 0.8611111111111112 | 0 |
| 0.8618055555555556 | 0 |
| 0.8624999999999999 | 0 |
| 0.8631944444444444 | 0 |
| 0.8638888888888889 | 0 |
| 0.8645833333333334 | 0 |
| 0.8652777777777777 | 0 |
| 0.8659722222222223 | 0 |
| 0.8666666666666667 | 0 |
| 0.8673611111111111 | 0 |
| 0.8680555555555555 | 0 |
| 0.86875 | 0 |
| 0.8694444444444445 | 0 |
| 0.8701388888888889 | 0 |
| 0.8708333333333332 | 0 |
| 0.8715277777777778 | 0 |
| 0.8722222222222222 | 0 |
| 0.8729166666666667 | 0 |
| 0.873611111111111 | 0 |
| 0.8743055555555556 | 0 |
| 0.875 | 0 |
| 0.8756944444444444 | 0 |
| 0.876388888888889 | 0 |
| 0.8770833333333333 | 0 |
| 0.8777777777777778 | 0 |
| 0.8784722222222222 | 0 |
| 0.8791666666666668 | 0 |
| 0.8798611111111111 | 0 |
| 0.8805555555555555 | 0 |
| 0.88125 | 0 |
| 0.8819444444444445 | 0 |
| 0.8826388888888889 | 0 |
| 0.8833333333333333 | 0 |
| 0.8840277777777777 | 0 |
| 0.8847222222222223 | 0 |
| 0.8854166666666666 | 0 |
| 0.8861111111111111 | 0 |
| 0.8868055555555556 | 0 |
| 0.8875000000000001 | 0 |
| 0.8881944444444444 | 0 |
| 0.8888888888888888 | 0 |
| 0.8895833333333334 | 0 |
| 0.8902777777777778 | 0 |
| 0.8909722222222222 | 0 |
| 0.8916666666666666 | 0 |
| 0.8923611111111112 | 0 |
| 0.8930555555555556 | 0 |
| 0.8937499999999999 | 0 |
| 0.8944444444444444 | 0 |
| 0.8951388888888889 | 0 |
| 0.8958333333333334 | 0 |
| 0.8965277777777777 | 0 |
| 0.8972222222222223 | 0 |
| 0.8979166666666667 | 0 |
| 0.8986111111111111 | 0 |
| 0.8993055555555555 | 0 |
| 0.9 | 0 |
| 0.9006944444444445 | 0 |
| 0.9013888888888889 | 0 |
| 0.9020833333333332 | 0 |
| 0.9027777777777778 | 0 |
| 0.9034722222222222 | 0 |
| 0.9041666666666667 | 0 |
| 0.904861111111111 | 0 |
| 0.9055555555555556 | 0 |
| 0.90625 | 0 |
| 0.9069444444444444 | 0 |
| 0.907638888888889 | 0 |
| 0.9083333333333333 | 0 |
| 0.9090277777777778 | 0 |
| 0.9097222222222222 | 0 |
| 0.9104166666666668 | 0 |
| 0.9111111111111111 | 0 |
| 0.9118055555555555 | 0 |
| 0.9125 | 0 |
| 0.9131944444444445 | 0 |
| 0.9138888888888889 | 0 |
| 0.9145833333333333 | 0 |
| 0.9152777777777777 | 0 |
| 0.9159722222222223 | 0 |
| 0.9166666666666666 | 0 |
| 0.9173611111111111 | 0 |
| 0.9180555555555556 | 0 |
| 0.9187500000000001 | 0 |
| 0.9194444444444444 | 0 |
| 0.9201388888888888 | 0 |
| 0.9208333333333334 | 0 |
| 0.9215277777777778 | 0 |
| 0.9222222222222222 | 0 |
| 0.9229166666666666 | 0 |
| 0.9236111111111112 | 0 |
| 0.9243055555555556 | 0 |
| 0.9249999999999999 | 0 |
| 0.9256944444444444 | 0 |
| 0.9263888888888889 | 0 |
| 0.9270833333333334 | 0 |
| 0.9277777777777777 | 0 |
| 0.9284722222222223 | 0 |
| 0.9291666666666667 | 0 |
| 0.9298611111111111 | 0 |
| 0.9305555555555555 | 0 |
| 0.93125 | 0 |
| 0.9319444444444445 | 0 |
| 0.9326388888888889 | 0 |
| 0.9333333333333332 | 0 |
| 0.9340277777777778 | 0 |
| 0.9347222222222222 | 0 |
| 0.9354166666666667 | 0 |
| 0.936111111111111 | 0 |
| 0.9368055555555556 | 0 |
| 0.9375 | 0 |
| 0.9381944444444444 | 0 |
| 0.938888888888889 | 0 |
| 0.9395833333333333 | 0 |
| 0.9402777777777778 | 0 |
| 0.9409722222222222 | 0 |
| 0.9416666666666668 | 0 |
| 0.9423611111111111 | 0 |
| 0.9430555555555555 | 0 |
| 0.94375 | 0 |
| 0.9444444444444445 | 0 |
| 0.9451388888888889 | 0 |
| 0.9458333333333333 | 0 |
| 0.9465277777777777 | 0 |
| 0.9472222222222223 | 0 |
| 0.9479166666666666 | 0 |
| 0.9486111111111111 | 0 |
| 0.9493055555555556 | 0 |
| 0.9500000000000001 | 0 |
| 0.9506944444444444 | 0 |
| 0.9513888888888888 | 0 |
| 0.9520833333333334 | 0 |
| 0.9527777777777778 | 0 |
| 0.9534722222222222 | 0 |
| 0.9541666666666666 | 0 |
| 0.9548611111111112 | 0 |
| 0.9555555555555556 | 0 |
| 0.9562499999999999 | 0 |
| 0.9569444444444444 | 0 |
| 0.9576388888888889 | 0 |
| 0.9583333333333334 | 0 |
| 0.9590277777777777 | 0 |
| 0.9597222222222223 | 0 |
| 0.9604166666666667 | 0 |
| 0.9611111111111111 | 0 |
| 0.9618055555555555 | 0 |
| 0.9625 | 0 |
| 0.9631944444444445 | 0 |
| 0.9638888888888889 | 0 |
| 0.9645833333333332 | 0 |
| 0.9652777777777778 | 0 |
| 0.9659722222222222 | 0 |
| 0.9666666666666667 | 0 |
| 0.967361111111111 | 0 |
| 0.9680555555555556 | 0 |
| 0.96875 | 0 |
| 0.9694444444444444 | 0 |
| 0.970138888888889 | 0 |
| 0.9708333333333333 | 0 |
| 0.9715277777777778 | 0 |
| 0.9722222222222222 | 0 |
| 0.9729166666666668 | 0 |
| 0.9736111111111111 | 0 |
| 0.9743055555555555 | 0 |
| 0.975 | 0 |
| 0.9756944444444445 | 0 |
| 0.9763888888888889 | 0 |
| 0.9770833333333333 | 0 |
| 0.9777777777777777 | 0 |
| 0.9784722222222223 | 0 |
| 0.9791666666666666 | 0 |
| 0.9798611111111111 | 0 |
| 0.9805555555555556 | 0 |
| 0.9812500000000001 | 0 |
| 0.9819444444444444 | 0 |
| 0.9826388888888888 | 0 |
| 0.9833333333333334 | 0 |
| 0.9840277777777778 | 0 |
| 0.9847222222222222 | 0 |
| 0.9854166666666666 | 0 |
| 0.9861111111111112 | 0 |
| 0.9868055555555556 | 0 |
| 0.9874999999999999 | 0 |
| 0.9881944444444444 | 0 |
| 0.9888888888888889 | 0 |
| 0.9895833333333334 | 0 |
| 0.9902777777777777 | 0 |
| 0.9909722222222223 | 0 |
| 0.9916666666666667 | 0 |
| 0.9923611111111111 | 0 |
| 0.9930555555555555 | 0 |
| 0.99375 | 0 |
| 0.9944444444444445 | 0 |
| 0.9951388888888889 | 0 |
| 0.9958333333333332 | 0 |
| 0.9965277777777778 | 0 |
| 0.9972222222222222 | 0 |
| 0.9979166666666667 | 0 |
| 0.998611111111111 | 0 |
| 0.9993055555555556 | 0 |